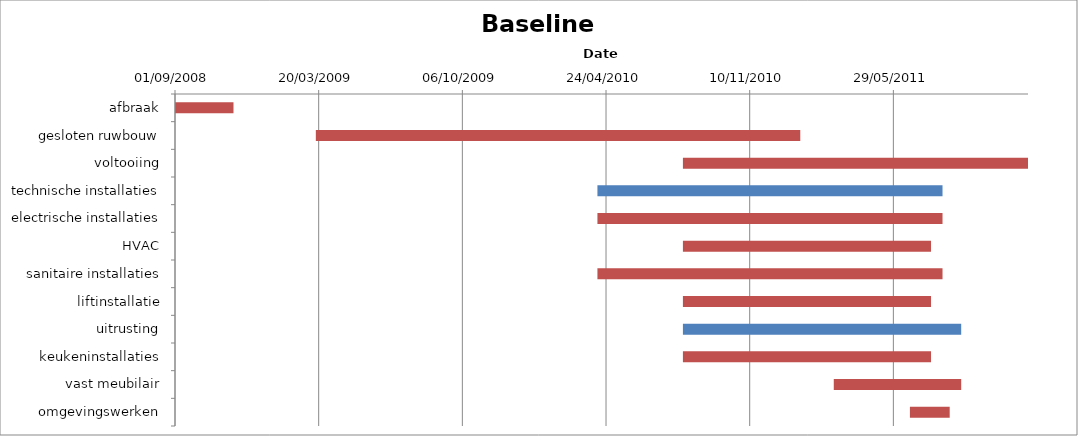
| Category | Baseline start | Actual duration |
|---|---|---|
| afbraak | 39692.333 | 81.375 |
| gesloten ruwbouw | 39888.333 | 674.375 |
| voltooiing | 40399.333 | 480.375 |
| technische installaties | 40280.333 | 480.375 |
| electrische installaties | 40280.333 | 480.375 |
| HVAC | 40399.333 | 345.375 |
| sanitaire installaties | 40280.333 | 480.375 |
| liftinstallatie | 40399.333 | 345.375 |
| uitrusting | 40399.333 | 387.375 |
| keukeninstallaties | 40399.333 | 345.375 |
| vast meubilair | 40609.333 | 177.375 |
| omgevingswerken | 40715.333 | 55.375 |